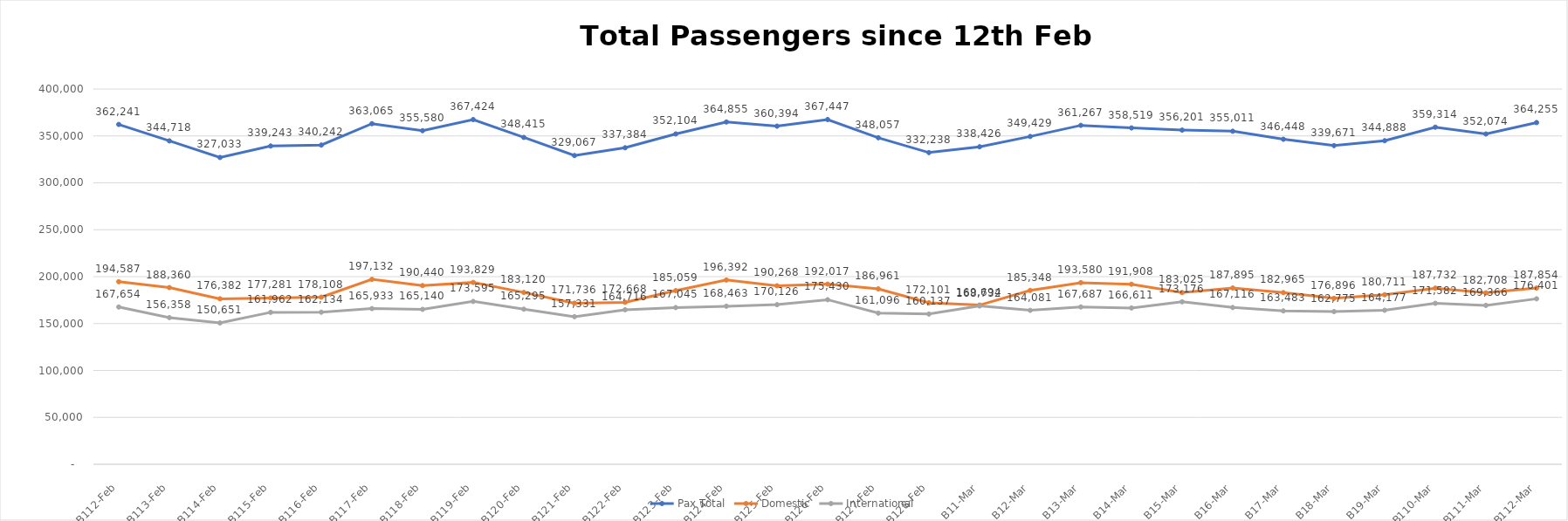
| Category | Pax Total |  Domestic  |  International  |
|---|---|---|---|
| 2023-02-12 | 362241 | 194587 | 167654 |
| 2023-02-13 | 344718 | 188360 | 156358 |
| 2023-02-14 | 327033 | 176382 | 150651 |
| 2023-02-15 | 339243 | 177281 | 161962 |
| 2023-02-16 | 340242 | 178108 | 162134 |
| 2023-02-17 | 363065 | 197132 | 165933 |
| 2023-02-18 | 355580 | 190440 | 165140 |
| 2023-02-19 | 367424 | 193829 | 173595 |
| 2023-02-20 | 348415 | 183120 | 165295 |
| 2023-02-21 | 329067 | 171736 | 157331 |
| 2023-02-22 | 337384 | 172668 | 164716 |
| 2023-02-23 | 352104 | 185059 | 167045 |
| 2023-02-24 | 364855 | 196392 | 168463 |
| 2023-02-25 | 360394 | 190268 | 170126 |
| 2023-02-26 | 367447 | 192017 | 175430 |
| 2023-02-27 | 348057 | 186961 | 161096 |
| 2023-02-28 | 332238 | 172101 | 160137 |
| 2023-03-01 | 338426 | 169694 | 168732 |
| 2023-03-02 | 349429 | 185348 | 164081 |
| 2023-03-03 | 361267 | 193580 | 167687 |
| 2023-03-04 | 358519 | 191908 | 166611 |
| 2023-03-05 | 356201 | 183025 | 173176 |
| 2023-03-06 | 355011 | 187895 | 167116 |
| 2023-03-07 | 346448 | 182965 | 163483 |
| 2023-03-08 | 339671 | 176896 | 162775 |
| 2023-03-09 | 344888 | 180711 | 164177 |
| 2023-03-10 | 359314 | 187732 | 171582 |
| 2023-03-11 | 352074 | 182708 | 169366 |
| 2023-03-12 | 364255 | 187854 | 176401 |